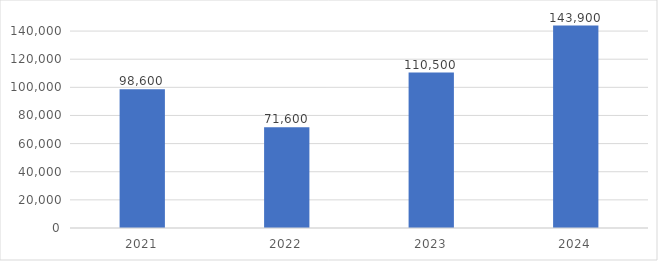
| Category | Series 0 |
|---|---|
| 2021.0 | 98600 |
| 2022.0 | 71600 |
| 2023.0 | 110500 |
| 2024.0 | 143900 |